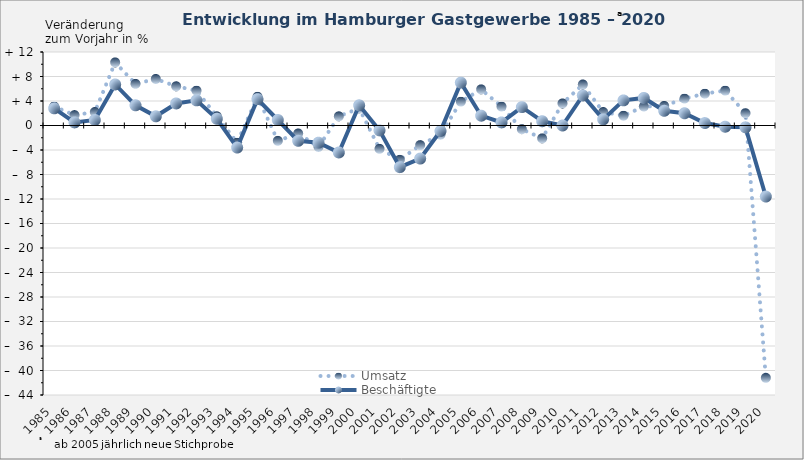
| Category | Umsatz | Beschäftigte |
|---|---|---|
| 1985.0 | 3.1 | 2.8 |
| 1986.0 | 1.7 | 0.5 |
| 1987.0 | 2.2 | 0.9 |
| 1988.0 | 10.3 | 6.7 |
| 1989.0 | 6.8 | 3.3 |
| 1990.0 | 7.6 | 1.5 |
| 1991.0 | 6.4 | 3.6 |
| 1992.0 | 5.7 | 4.1 |
| 1993.0 | 1.5 | 1.1 |
| 1994.0 | -2.8 | -3.6 |
| 1995.0 | 4.7 | 4.3 |
| 1996.0 | -2.5 | 0.9 |
| 1997.0 | -1.3 | -2.5 |
| 1998.0 | -3.5 | -2.8 |
| 1999.0 | 1.5 | -4.4 |
| 2000.0 | 2.8 | 3.3 |
| 2001.0 | -3.8 | -0.8 |
| 2002.0 | -5.6 | -6.8 |
| 2003.0 | -3.2 | -5.4 |
| 2004.0 | -1.5 | -0.9 |
| 2005.0 | 3.9 | 7 |
| 2006.0 | 5.9 | 1.6 |
| 2007.0 | 3.1 | 0.5 |
| 2008.0 | -0.6 | 3 |
| 2009.0 | -2.1 | 0.7 |
| 2010.0 | 3.6 | 0 |
| 2011.0 | 6.7 | 4.9 |
| 2012.0 | 2.2 | 1 |
| 2013.0 | 1.6 | 4.1 |
| 2014.0 | 3.1 | 4.5 |
| 2015.0 | 3.2 | 2.4 |
| 2016.0 | 4.4 | 2 |
| 2017.0 | 5.2 | 0.4 |
| 2018.0 | 5.7 | -0.2 |
| 2019.0 | 2 | -0.3 |
| 2020.0 | -41.2 | -11.6 |